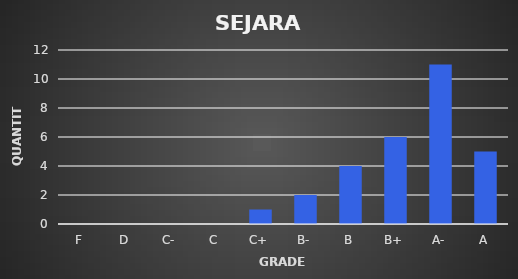
| Category | Series 0 |
|---|---|
| F | 0 |
| D | 0 |
| C- | 0 |
| C | 0 |
| C+ | 1 |
| B- | 2 |
| B | 4 |
| B+ | 6 |
| A- | 11 |
| A | 5 |